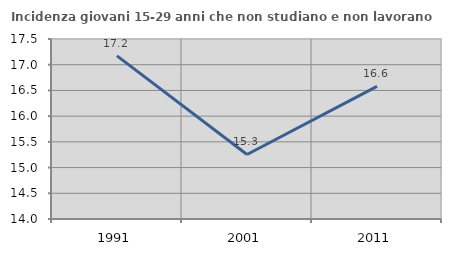
| Category | Incidenza giovani 15-29 anni che non studiano e non lavorano  |
|---|---|
| 1991.0 | 17.172 |
| 2001.0 | 15.254 |
| 2011.0 | 16.58 |